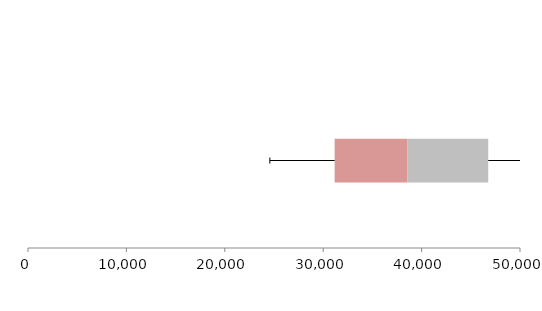
| Category | Series 1 | Series 2 | Series 3 |
|---|---|---|---|
| 0 | 31163.865 | 7380.446 | 8227.172 |